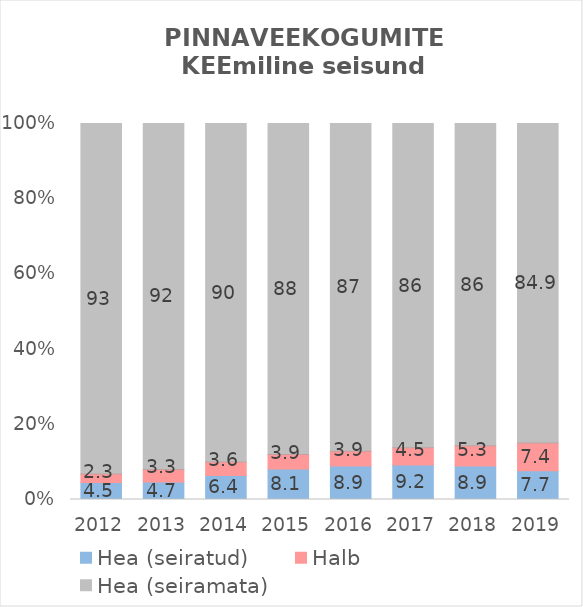
| Category | Hea (seiratud) | Halb | Hea (seiramata) |
|---|---|---|---|
| 2012.0 | 4.533 | 2.267 | 93.2 |
| 2013.0 | 4.667 | 3.333 | 92 |
| 2014.0 | 6.4 | 3.6 | 90 |
| 2015.0 | 8.133 | 3.867 | 88 |
| 2016.0 | 8.933 | 3.867 | 87.2 |
| 2017.0 | 9.2 | 4.533 | 86.267 |
| 2018.0 | 8.933 | 5.333 | 85.733 |
| 2019.0 | 7.661 | 7.392 | 84.946 |